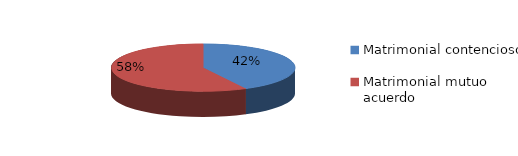
| Category | Series 0 |
|---|---|
| 0 | 606 |
| 1 | 826 |